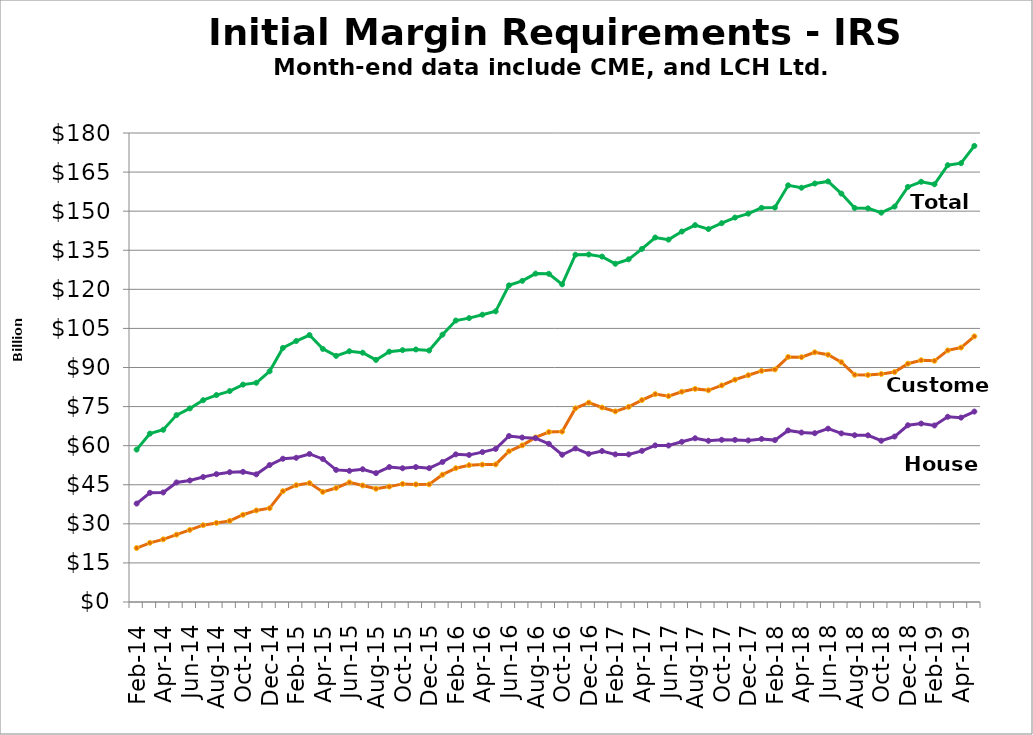
| Category | Customer | House | Total |
|---|---|---|---|
| 2014-02-28 |  |  |  |
| nan |  |  |  |
| 2014-04-30 |  |  |  |
| nan |  |  |  |
| 2014-06-30 |  |  |  |
| nan |  |  |  |
| 2014-08-29 |  |  |  |
| nan |  |  |  |
| 2014-10-31 |  |  |  |
| nan |  |  |  |
| 2014-12-31 |  |  |  |
| nan |  |  |  |
| 2015-02-27 |  |  |  |
| nan |  |  |  |
| 2015-04-30 |  |  |  |
| nan |  |  |  |
| 2015-06-30 |  |  |  |
| nan |  |  |  |
| 2015-08-31 |  |  |  |
| nan |  |  |  |
| 2015-10-30 |  |  |  |
| nan |  |  |  |
| 2015-12-31 |  |  |  |
| nan |  |  |  |
| 2016-02-29 |  |  |  |
| nan |  |  |  |
| 2016-04-29 |  |  |  |
| nan |  |  |  |
| 2016-06-30 |  |  |  |
| nan |  |  |  |
| 2016-08-31 |  |  |  |
| nan |  |  |  |
| 2016-10-31 |  |  |  |
| nan |  |  |  |
| 2016-12-30 |  |  |  |
| nan |  |  |  |
| 2017-02-28 |  |  |  |
| nan |  |  |  |
| 2017-04-28 |  |  |  |
| nan |  |  |  |
| 2017-06-30 |  |  |  |
| nan |  |  |  |
| 2017-08-31 |  |  |  |
| nan |  |  |  |
| 2017-10-31 |  |  |  |
| nan |  |  |  |
| 2017-12-29 |  |  |  |
| nan |  |  |  |
| 2018-02-28 |  |  |  |
| nan |  |  |  |
| 2018-04-30 |  |  |  |
| nan |  |  |  |
| 2018-06-29 |  |  |  |
| nan |  |  |  |
| 2018-08-31 |  |  |  |
| nan |  |  |  |
| 2018-10-31 |  |  |  |
| nan |  |  |  |
| 2018-12-31 |  |  |  |
| nan |  |  |  |
| 2019-02-28 |  |  |  |
| nan |  |  |  |
| 2019-04-30 |  |  |  |
| nan |  |  |  |